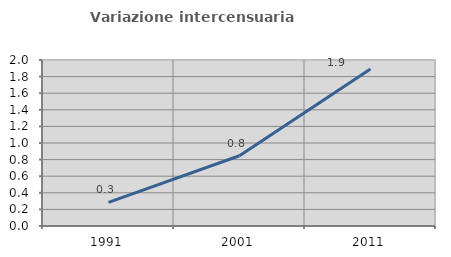
| Category | Variazione intercensuaria annua |
|---|---|
| 1991.0 | 0.285 |
| 2001.0 | 0.847 |
| 2011.0 | 1.89 |